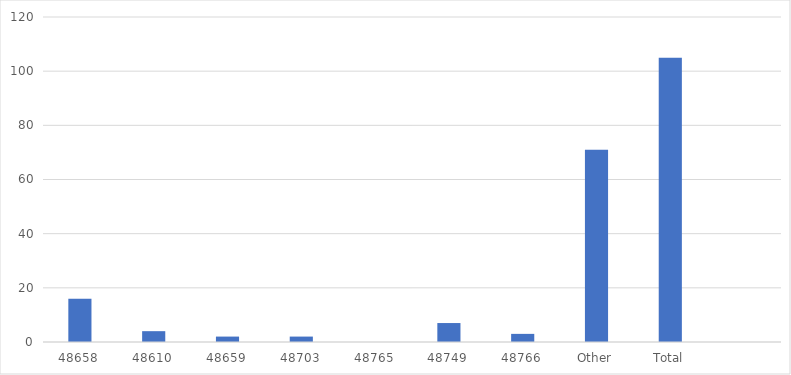
| Category | Number of Responses |
|---|---|
| 48658 | 16 |
| 48610 | 4 |
| 48659 | 2 |
| 48703 | 2 |
| 48765 | 0 |
| 48749 | 7 |
| 48766 | 3 |
| Other | 71 |
| Total | 105 |